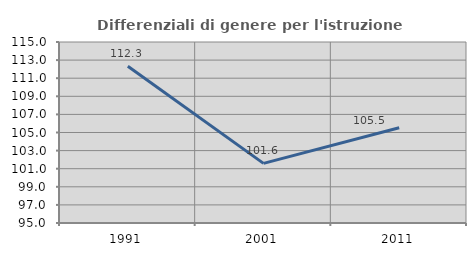
| Category | Differenziali di genere per l'istruzione superiore |
|---|---|
| 1991.0 | 112.328 |
| 2001.0 | 101.59 |
| 2011.0 | 105.518 |